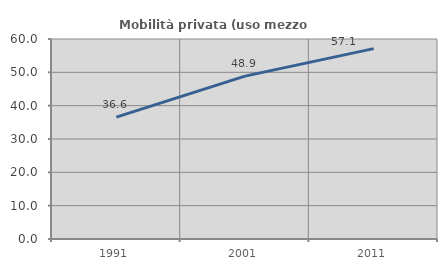
| Category | Mobilità privata (uso mezzo privato) |
|---|---|
| 1991.0 | 36.558 |
| 2001.0 | 48.861 |
| 2011.0 | 57.103 |